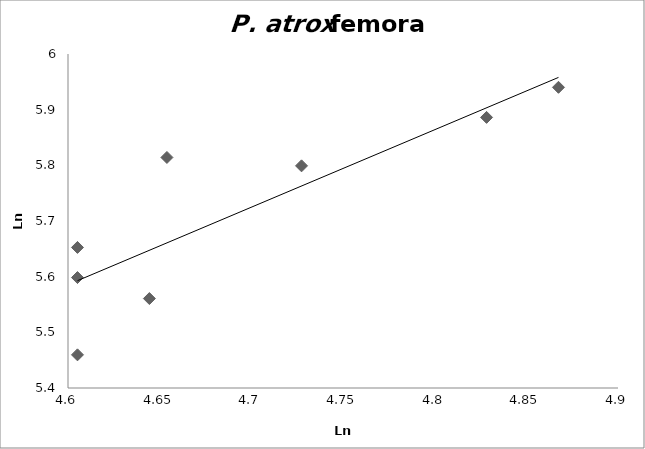
| Category | Series 0 |
|---|---|
| 4.727387818712341 | 5.799 |
| 4.867534450455582 | 5.94 |
| 4.653960350157523 | 5.814 |
| 4.605170185988092 | 5.598 |
| 4.605170185988092 | 5.652 |
| 4.828313737302301 | 5.886 |
| 4.605170185988092 | 5.46 |
| 4.644390899141372 | 5.561 |